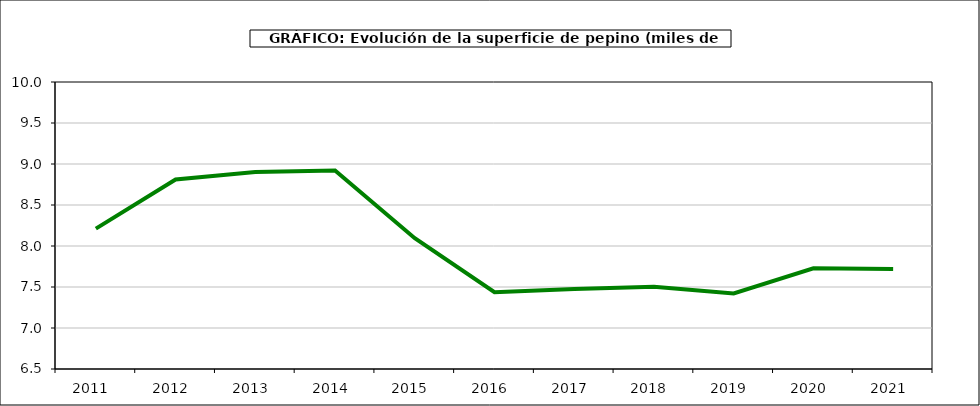
| Category | superficie |
|---|---|
| 2011.0 | 8.212 |
| 2012.0 | 8.811 |
| 2013.0 | 8.902 |
| 2014.0 | 8.921 |
| 2015.0 | 8.095 |
| 2016.0 | 7.437 |
| 2017.0 | 7.475 |
| 2018.0 | 7.503 |
| 2019.0 | 7.422 |
| 2020.0 | 7.728 |
| 2021.0 | 7.718 |